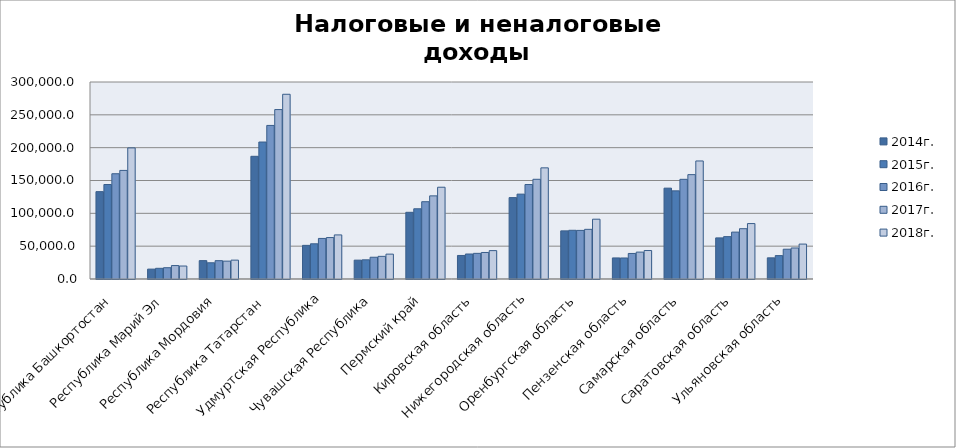
| Category | 2013г. | 2014г. | 2015г. | 2016г. | 2017г. | 2018г. |
|---|---|---|---|---|---|---|
| Республика Башкортостан |  | 133038.376 | 143897.306 | 160293.869 | 165357.097 | 199632.703 |
| Республика Марий Эл |  | 15049.829 | 16288.363 | 17197.375 | 20468.649 | 19758.423 |
| Республика Мордовия |  | 27960.702 | 24699.52 | 27930.553 | 27216.182 | 28742.797 |
| Республика Татарстан  |  | 186853.835 | 208598.156 | 233871.727 | 258016.278 | 281304.394 |
| Удмуртская Республика |  | 51207.494 | 53619.892 | 61771.712 | 63123.507 | 67136.549 |
| Чувашская Республика |  | 28704.64 | 29206.746 | 33128.375 | 34500.189 | 37876.871 |
| Пермский край |  | 101561.854 | 106932.248 | 117696.278 | 126604.108 | 139755.376 |
| Кировская область |  | 35847.211 | 38047.545 | 39061.434 | 40402.299 | 43223.877 |
| Нижегородская область |  | 123955.267 | 129238.597 | 143867.468 | 151844.954 | 169253.479 |
| Оренбургская область |  | 73287.679 | 74182.874 | 74012.445 | 75642.138 | 91075.441 |
| Пензенская область |  | 32089.356 | 32008.269 | 38902.809 | 40963.165 | 43376.927 |
| Самарская область |  | 138344.341 | 134212.513 | 151801.898 | 158946.403 | 179766.601 |
| Саратовская область |  | 62601.388 | 64507.033 | 71383.858 | 76609.148 | 84413.477 |
| Ульяновская область |  | 32240.382 | 35637.533 | 45353.946 | 47244.369 | 53177.441 |